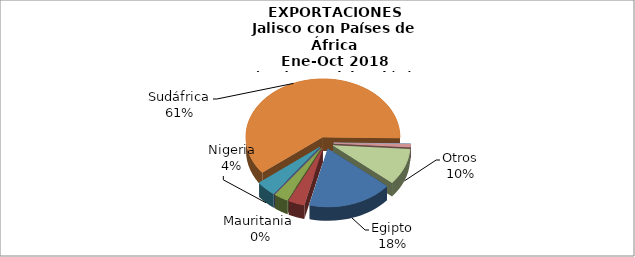
| Category | EXPORTACIONES |
|---|---|
| Egipto | 18.459 |
| Marruecos | 3.554 |
| Mauricio | 3.086 |
| Mauritania  | 0.008 |
| Nigeria | 4.389 |
| Sudáfrica | 63.288 |
| Swazilandia | 0.023 |
| Túnez | 0.803 |
| Otros | 10.48 |